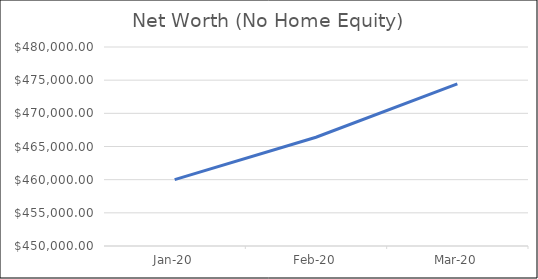
| Category | Series 0 |
|---|---|
| 2020-01-01 | 460000 |
| 2020-02-01 | 466400 |
| 2020-03-01 | 474450 |